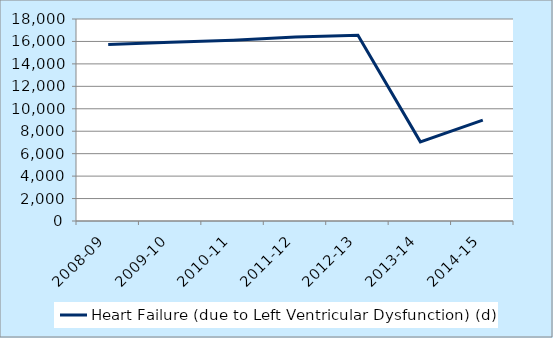
| Category | Heart Failure (due to Left Ventricular Dysfunction) (d) |
|---|---|
| 2008-09 | 15730 |
| 2009-10 | 15920 |
| 2010-11 | 16102 |
| 2011-12 | 16393 |
| 2012-13 | 16547 |
| 2013-14 | 7056 |
| 2014-15 | 8987 |